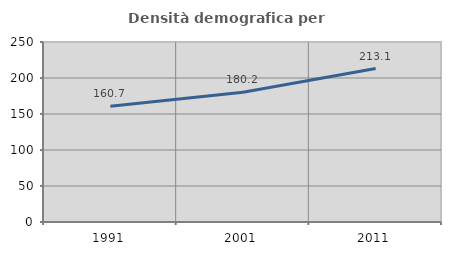
| Category | Densità demografica |
|---|---|
| 1991.0 | 160.722 |
| 2001.0 | 180.222 |
| 2011.0 | 213.075 |